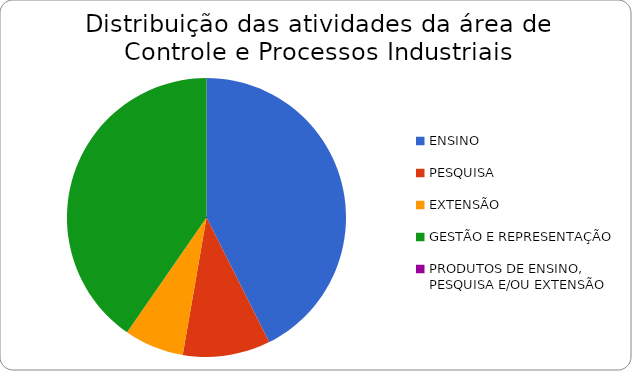
| Category | Porcentagem |
|---|---|
| ENSINO | 42.583 |
| PESQUISA | 10.146 |
| EXTENSÃO | 6.918 |
| GESTÃO E REPRESENTAÇÃO | 40.354 |
| PRODUTOS DE ENSINO, PESQUISA E/OU EXTENSÃO | 0 |